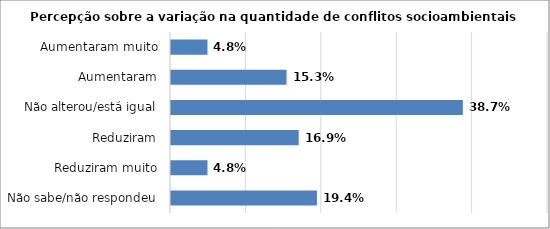
| Category | Series 0 |
|---|---|
| Não sabe/não respondeu | 0.194 |
| Reduziram muito | 0.048 |
| Reduziram | 0.169 |
| Não alterou/está igual | 0.387 |
| Aumentaram | 0.153 |
| Aumentaram muito | 0.048 |